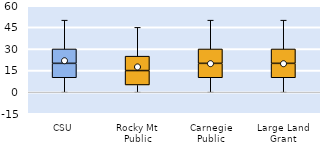
| Category | 25th | 50th | 75th |
|---|---|---|---|
| CSU | 10 | 10 | 10 |
| Rocky Mt Public | 5 | 10 | 10 |
| Carnegie Public | 10 | 10 | 10 |
| Large Land Grant | 10 | 10 | 10 |